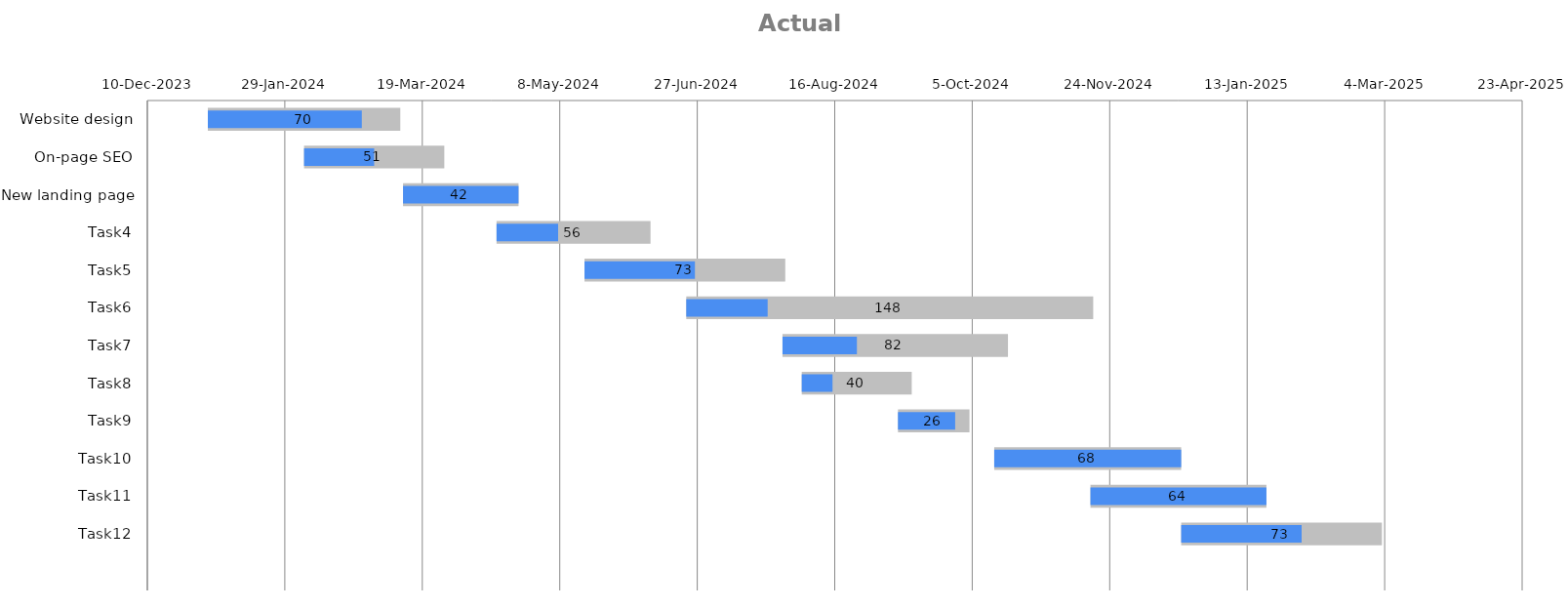
| Category | Timeline chart start date |  Total No. of days |
|---|---|---|
| Website design | 1/1/24 | 70 |
| On-page SEO | 2/5/24 | 51 |
| New landing page | 3/12/24 | 42 |
| Task4 | 4/15/24 | 56 |
| Task5 | 5/17/24 | 73 |
| Task6 | 6/23/24 | 148 |
| Task7 | 7/28/24 | 82 |
| Task8 | 8/4/24 | 40 |
| Task9 | 9/8/24 | 26 |
| Task10 | 10/13/24 | 68 |
| Task11 | 11/17/24 | 64 |
| Task12 | 12/20/24 | 73 |